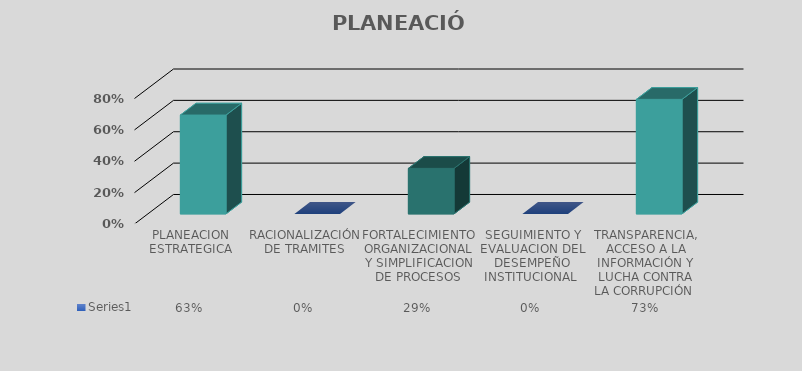
| Category | Series 0 |
|---|---|
| PLANEACION ESTRATEGICA | 0.63 |
| RACIONALIZACIÓN DE TRAMITES | 0 |
| FORTALECIMIENTO ORGANIZACIONAL Y SIMPLIFICACION DE PROCESOS | 0.29 |
| SEGUIMIENTO Y EVALUACION DEL DESEMPEÑO INSTITUCIONAL  | 0 |
| TRANSPARENCIA, ACCESO A LA INFORMACIÓN Y LUCHA CONTRA LA CORRUPCIÓN  | 0.73 |